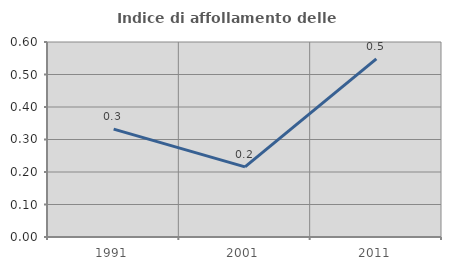
| Category | Indice di affollamento delle abitazioni  |
|---|---|
| 1991.0 | 0.332 |
| 2001.0 | 0.216 |
| 2011.0 | 0.548 |